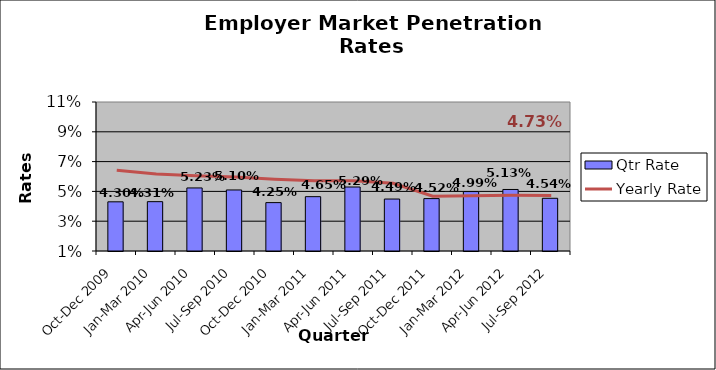
| Category | Qtr Rate |
|---|---|
| Oct-Dec 2009 | 0.043 |
| Jan-Mar 2010 | 0.043 |
| Apr-Jun 2010 | 0.052 |
| Jul-Sep 2010 | 0.051 |
| Oct-Dec 2010 | 0.042 |
| Jan-Mar 2011 | 0.046 |
| Apr-Jun 2011 | 0.053 |
| Jul-Sep 2011 | 0.045 |
| Oct-Dec 2011 | 0.045 |
| Jan-Mar 2012 | 0.05 |
| Apr-Jun 2012 | 0.051 |
| Jul-Sep 2012 | 0.045 |